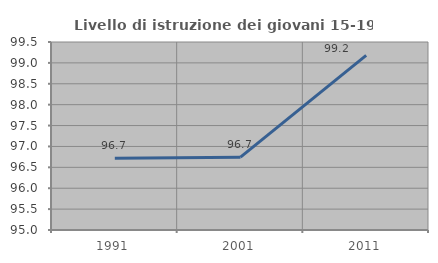
| Category | Livello di istruzione dei giovani 15-19 anni |
|---|---|
| 1991.0 | 96.716 |
| 2001.0 | 96.744 |
| 2011.0 | 99.18 |